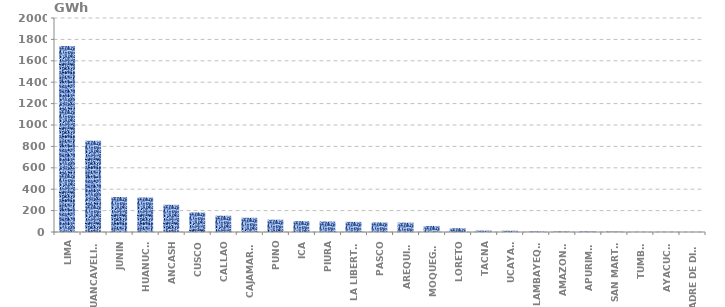
| Category | Series 0 |
|---|---|
| LIMA | 1739.066 |
| HUANCAVELICA | 853.416 |
| JUNIN | 327.315 |
| HUANUCO | 322.534 |
| ANCASH | 254.146 |
| CUSCO | 182.446 |
| CALLAO | 152.052 |
| CAJAMARCA | 133.029 |
| PUNO | 114.791 |
| ICA | 101.608 |
| PIURA | 97.718 |
| LA LIBERTAD | 94.693 |
| PASCO | 89.277 |
| AREQUIPA | 87.325 |
| MOQUEGUA | 56.398 |
| LORETO | 35.45 |
| TACNA | 13.219 |
| UCAYALI | 11.823 |
| LAMBAYEQUE | 5.347 |
| AMAZONAS | 4.525 |
| APURIMAC | 4.4 |
| SAN MARTÍN | 3.461 |
| TUMBES | 1.101 |
| AYACUCHO | 1.061 |
| MADRE DE DIOS | 0.108 |